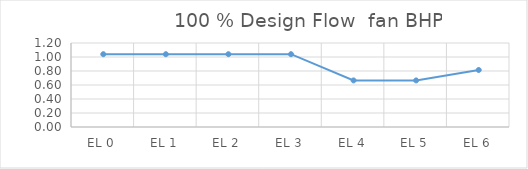
| Category |                100 % Design Flow  fan BHP |
|---|---|
| EL 0 | 1.04 |
| EL 1 | 1.04 |
| EL 2 | 1.04 |
| EL 3 | 1.04 |
| EL 4 | 0.666 |
| EL 5 | 0.666 |
| EL 6 | 0.814 |